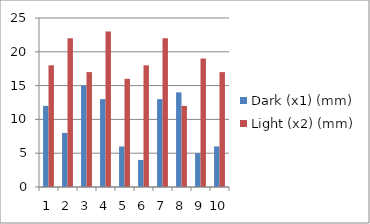
| Category | Dark (x1) (mm) | Light (x2) (mm) |
|---|---|---|
| 0 | 12 | 18 |
| 1 | 8 | 22 |
| 2 | 15 | 17 |
| 3 | 13 | 23 |
| 4 | 6 | 16 |
| 5 | 4 | 18 |
| 6 | 13 | 22 |
| 7 | 14 | 12 |
| 8 | 5 | 19 |
| 9 | 6 | 17 |